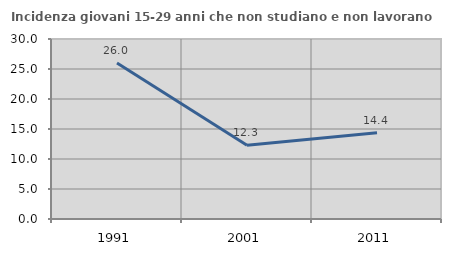
| Category | Incidenza giovani 15-29 anni che non studiano e non lavorano  |
|---|---|
| 1991.0 | 26.011 |
| 2001.0 | 12.284 |
| 2011.0 | 14.36 |